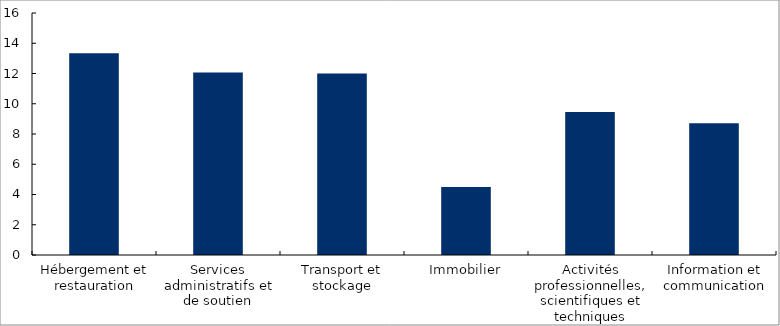
| Category | Q2 2022 |
|---|---|
| Hébergement et restauration | 13.335 |
| Services administratifs et de soutien | 12.069 |
| Transport et stockage | 12.004 |
| Immobilier | 4.5 |
| Activités professionnelles, scientifiques et techniques | 9.462 |
| Information et communication | 8.714 |